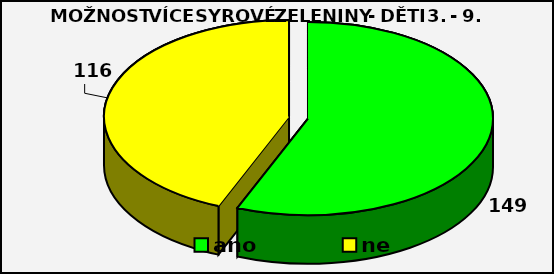
| Category | Series 0 |
|---|---|
| ano | 149 |
| ne | 116 |